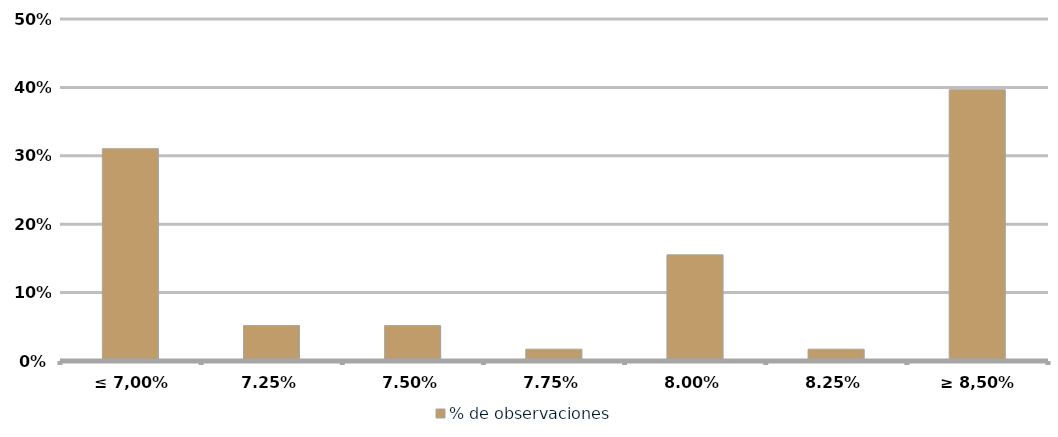
| Category | % de observaciones  |
|---|---|
| ≤ 7,00% | 0.31 |
| 7,25% | 0.052 |
| 7,50% | 0.052 |
| 7,75% | 0.017 |
| 8,00% | 0.155 |
| 8,25% | 0.017 |
| ≥ 8,50% | 0.397 |